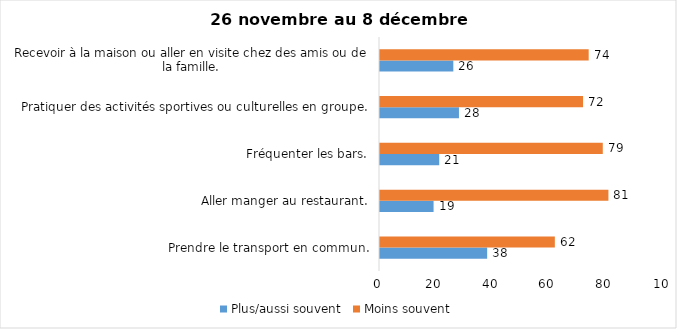
| Category | Plus/aussi souvent | Moins souvent |
|---|---|---|
| Prendre le transport en commun. | 38 | 62 |
| Aller manger au restaurant. | 19 | 81 |
| Fréquenter les bars. | 21 | 79 |
| Pratiquer des activités sportives ou culturelles en groupe. | 28 | 72 |
| Recevoir à la maison ou aller en visite chez des amis ou de la famille. | 26 | 74 |